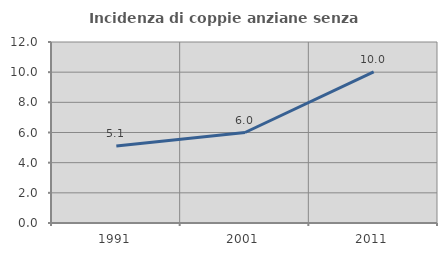
| Category | Incidenza di coppie anziane senza figli  |
|---|---|
| 1991.0 | 5.098 |
| 2001.0 | 5.999 |
| 2011.0 | 10.019 |